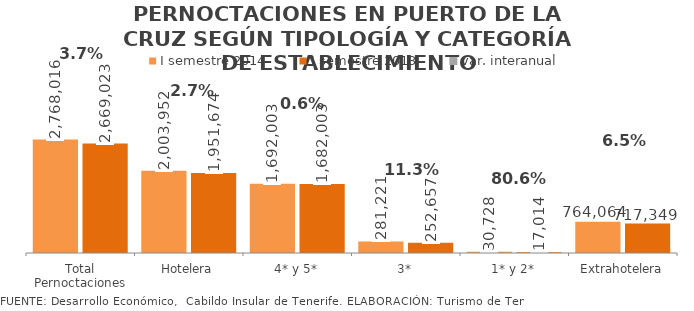
| Category | I semestre 2014 | I semestre 2013 |
|---|---|---|
| Total Pernoctaciones | 2768016 | 2669023 |
| Hotelera | 2003952 | 1951674 |
| 4* y 5* | 1692003 | 1682003 |
| 3* | 281221 | 252657 |
| 1* y 2* | 30728 | 17014 |
| Extrahotelera | 764064 | 717349 |